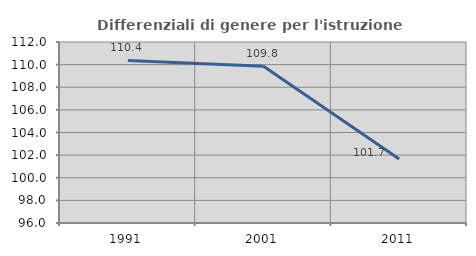
| Category | Differenziali di genere per l'istruzione superiore |
|---|---|
| 1991.0 | 110.367 |
| 2001.0 | 109.848 |
| 2011.0 | 101.65 |